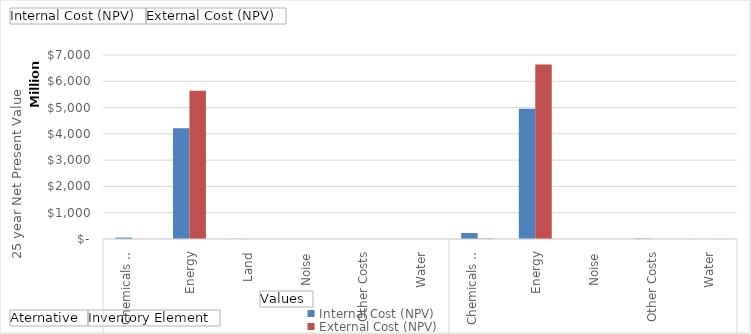
| Category | Internal Cost (NPV) | External Cost (NPV) |
|---|---|---|
| 0 | 52980774.509 | 4174569.934 |
| 1 | 4209035461.441 | 5640458073.753 |
| 2 | 6205202.312 | 676574.094 |
| 3 | 0 | 2319.444 |
| 4 | 122244.994 | 9995.658 |
| 5 | 18984.335 | 239083.714 |
| 6 | 227276328.691 | 15315331.592 |
| 7 | 4951769203.308 | 6635809925.986 |
| 8 | 0 | 9166.334 |
| 9 | 17041935.184 | 608493.501 |
| 10 | 2013522.537 | 1368854.721 |